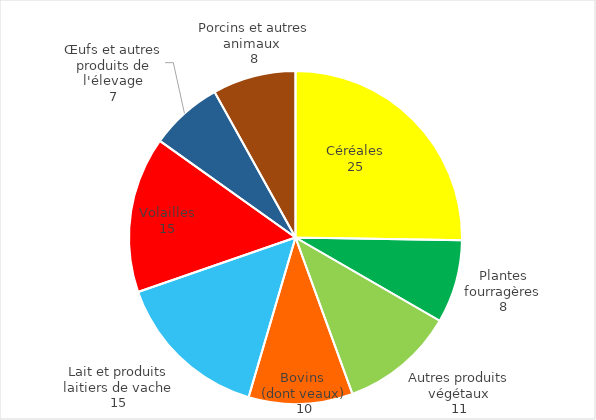
| Category | Series 0 |
|---|---|
| Céréales | 25 |
| Plantes fourragères | 8 |
| Autres produits végétaux | 11 |
| Bovins 
(dont veaux) | 10 |
| Lait et produits laitiers de vache | 15 |
| Volailles | 15 |
| Œufs et autres produits de l'élevage | 7 |
| Porcins et autres animaux  | 8 |